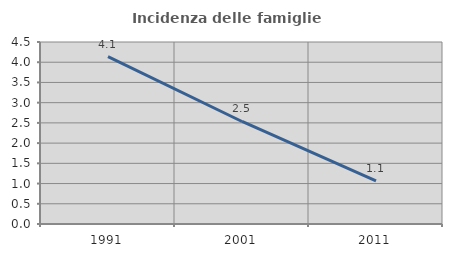
| Category | Incidenza delle famiglie numerose |
|---|---|
| 1991.0 | 4.136 |
| 2001.0 | 2.535 |
| 2011.0 | 1.065 |